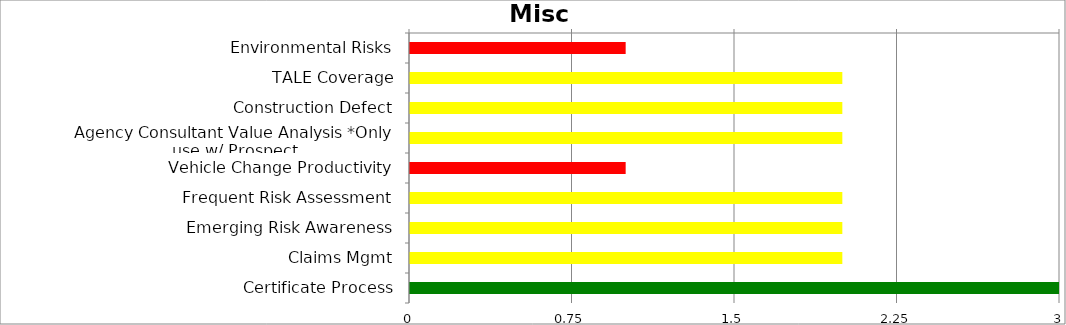
| Category | Low | Medium | High |
|---|---|---|---|
| Environmental Risks | 0 | 0 | 1 |
| TALE Coverage | 0 | 2 | 0 |
| Construction Defect | 0 | 2 | 0 |
| Agency Consultant Value Analysis *Only use w/ Prospect | 0 | 2 | 0 |
| Vehicle Change Productivity | 0 | 0 | 1 |
| Frequent Risk Assessment | 0 | 2 | 0 |
| Emerging Risk Awareness | 0 | 2 | 0 |
| Claims Mgmt | 0 | 2 | 0 |
| Certificate Process | 3 | 0 | 0 |